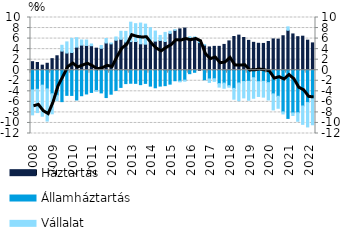
| Category | Háztartás | Államháztartás | Vállalat |
|---|---|---|---|
| 2008.0 | 1.621 | -3.734 | -4.732 |
| 2008.0 | 1.462 | -3.614 | -4.417 |
| 2008.0 | 0.957 | -2.83 | -5.897 |
| 2008.0 | 1.318 | -3.538 | -6.101 |
| 2009.0 | 2.194 | -4.465 | -3.796 |
| 2009.0 | 2.742 | -4.759 | -1.033 |
| 2009.0 | 3.626 | -5.956 | 1.105 |
| 2009.0 | 3.26 | -4.764 | 2.113 |
| 2010.0 | 3.36 | -4.776 | 2.682 |
| 2010.0 | 4.379 | -5.639 | 1.787 |
| 2010.0 | 4.761 | -4.833 | 0.971 |
| 2010.0 | 4.7 | -4.502 | 1.027 |
| 2011.0 | 4.649 | -4.208 | 0.328 |
| 2011.0 | 4.185 | -3.872 | -0.137 |
| 2011.0 | 4.158 | -4.3 | 0.525 |
| 2011.0 | 5.166 | -5.185 | 0.85 |
| 2012.0 | 4.998 | -4.545 | 0.169 |
| 2012.0 | 5.687 | -3.826 | 0.621 |
| 2012.0 | 5.862 | -3.256 | 1.519 |
| 2012.0 | 5.354 | -2.537 | 2.013 |
| 2013.0 | 5.433 | -2.467 | 3.68 |
| 2013.0 | 5.45 | -2.489 | 3.381 |
| 2013.0 | 5.013 | -2.735 | 3.932 |
| 2013.0 | 4.939 | -2.497 | 3.805 |
| 2014.0 | 5.336 | -3.015 | 2.73 |
| 2014.0 | 5.519 | -3.329 | 1.911 |
| 2014.0 | 5.657 | -3.008 | 0.941 |
| 2014.0 | 5.443 | -2.925 | 1.727 |
| 2015.0 | 6.986 | -2.637 | 0.404 |
| 2015.0 | 7.562 | -1.996 | 0.134 |
| 2015.0 | 7.839 | -2.068 | -0.143 |
| 2015.0 | 7.996 | -1.869 | -0.21 |
| 2016.0 | 6.211 | -0.655 | 0.137 |
| 2016.0 | 5.984 | -0.392 | 0.343 |
| 2016.0 | 5.236 | 0.088 | 0.173 |
| 2016.0 | 4.774 | -1.814 | 0.087 |
| 2017.0 | 4.421 | -1.653 | -0.663 |
| 2017.0 | 4.525 | -1.613 | -0.498 |
| 2017.0 | 4.526 | -2.541 | -0.659 |
| 2017.0 | 4.895 | -2.444 | -0.976 |
| 2018.0 | 5.562 | -2.929 | -0.292 |
| 2018.0 | 6.399 | -3.441 | -2.052 |
| 2018.0 | 6.655 | -2.419 | -3.366 |
| 2018.0 | 6.205 | -2.132 | -3.113 |
| 2019.0 | 5.664 | -2.106 | -3.588 |
| 2019.0 | 5.29 | -1.428 | -3.888 |
| 2019.0 | 5.108 | -2.177 | -2.797 |
| 2019.0 | 5.08 | -2.11 | -2.994 |
| 2020.0 | 5.445 | -2.361 | -3.279 |
| 2020.0 | 5.937 | -4.486 | -3.037 |
| 2020.0 | 5.895 | -4.94 | -2.273 |
| 2020.0 | 6.54 | -7.902 | -0.393 |
| 2021.0 | 7.577 | -9.134 | 0.649 |
| 2021.0 | 6.883 | -8.094 | -0.49 |
| 2021.0 | 6.363 | -8.063 | -1.615 |
| 2021.0 | 6.455 | -6.783 | -3.484 |
| 2022.0 | 5.702 | -6.14 | -4.614 |
| 2022.0 | 5.182 | -5.372 | -4.971 |